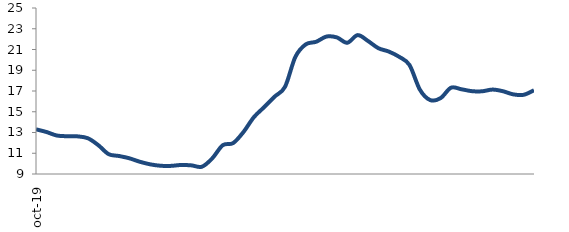
| Category | Series 0 |
|---|---|
| 2019-10-01 | 13.304 |
| 2019-11-01 | 13.05 |
| 2019-12-01 | 12.71 |
| 2020-01-01 | 12.642 |
| 2020-02-01 | 12.627 |
| 2020-03-01 | 12.445 |
| 2020-04-01 | 11.784 |
| 2020-05-01 | 10.914 |
| 2020-06-01 | 10.736 |
| 2020-07-01 | 10.514 |
| 2020-08-01 | 10.182 |
| 2020-09-01 | 9.933 |
| 2020-10-01 | 9.795 |
| 2020-11-01 | 9.783 |
| 2020-12-01 | 9.869 |
| 2021-01-01 | 9.83 |
| 2021-02-01 | 9.703 |
| 2021-03-01 | 10.521 |
| 2021-04-01 | 11.773 |
| 2021-05-01 | 11.98 |
| 2021-06-01 | 13.052 |
| 2021-07-01 | 14.478 |
| 2021-08-01 | 15.452 |
| 2021-09-01 | 16.459 |
| 2021-10-01 | 17.401 |
| 2021-11-01 | 20.289 |
| 2021-12-01 | 21.495 |
| 2022-01-01 | 21.744 |
| 2022-02-01 | 22.249 |
| 2022-03-01 | 22.164 |
| 2022-04-01 | 21.65 |
| 2022-05-01 | 22.386 |
| 2022-06-01 | 21.821 |
| 2022-07-01 | 21.126 |
| 2022-08-01 | 20.803 |
| 2022-09-01 | 20.298 |
| 2022-10-01 | 19.505 |
| 2022-11-01 | 17.131 |
| 2022-12-01 | 16.123 |
| 2023-01-01 | 16.316 |
| 2023-02-01 | 17.317 |
| 2023-03-01 | 17.168 |
| 2023-04-01 | 16.986 |
| 2023-05-01 | 16.972 |
| 2023-06-01 | 17.138 |
| 2023-07-01 | 16.98 |
| 2023-08-01 | 16.677 |
| 2023-09-01 | 16.633 |
| 2023-10-01 | 17.067 |